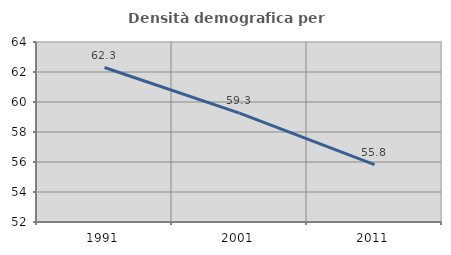
| Category | Densità demografica |
|---|---|
| 1991.0 | 62.297 |
| 2001.0 | 59.254 |
| 2011.0 | 55.828 |